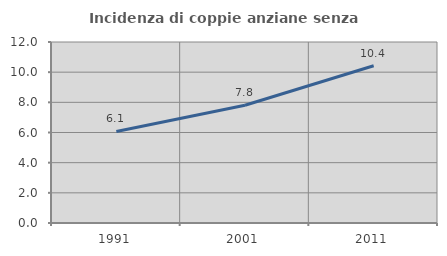
| Category | Incidenza di coppie anziane senza figli  |
|---|---|
| 1991.0 | 6.067 |
| 2001.0 | 7.808 |
| 2011.0 | 10.422 |